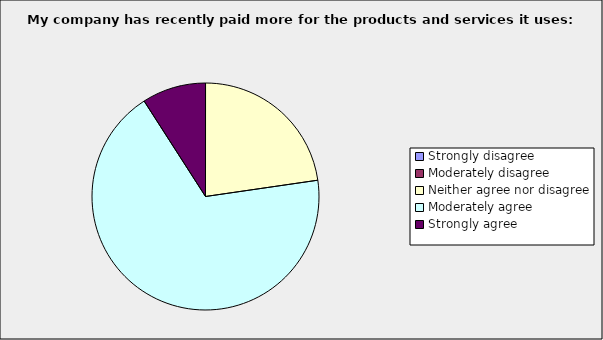
| Category | Series 0 |
|---|---|
| Strongly disagree | 0 |
| Moderately disagree | 0 |
| Neither agree nor disagree | 0.227 |
| Moderately agree | 0.682 |
| Strongly agree | 0.091 |